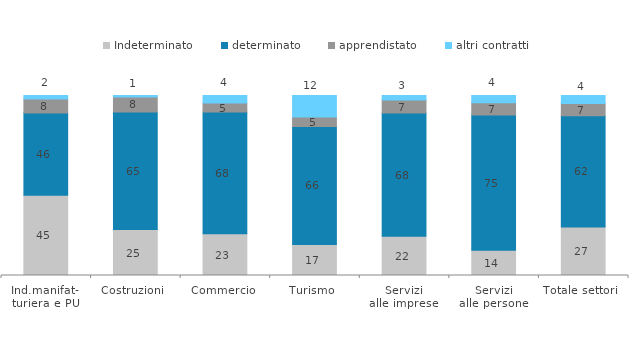
| Category | Indeterminato | determinato | apprendistato | altri contratti |
|---|---|---|---|---|
| Ind.manifat-
turiera e PU | 44.597 | 45.71 | 7.733 | 1.96 |
| Costruzioni | 25.499 | 65.284 | 8.449 | 0.768 |
| Commercio | 23.179 | 67.66 | 4.967 | 4.194 |
| Turismo | 17.251 | 65.569 | 5.225 | 11.954 |
| Servizi
alle imprese | 21.795 | 68.437 | 7.265 | 2.503 |
| Servizi
alle persone | 14.008 | 75.097 | 6.809 | 4.086 |
| Totale settori | 26.995 | 61.824 | 6.763 | 4.418 |